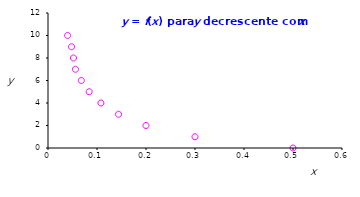
| Category | Series 0 |
|---|---|
| 0.5 | 0 |
| 0.3 | 1 |
| 0.2 | 2 |
| 0.144 | 3 |
| 0.108 | 4 |
| 0.084 | 5 |
| 0.068 | 6 |
| 0.056 | 7 |
| 0.052 | 8 |
| 0.048 | 9 |
| 0.04 | 10 |